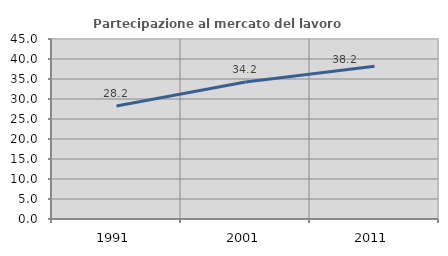
| Category | Partecipazione al mercato del lavoro  femminile |
|---|---|
| 1991.0 | 28.231 |
| 2001.0 | 34.228 |
| 2011.0 | 38.176 |